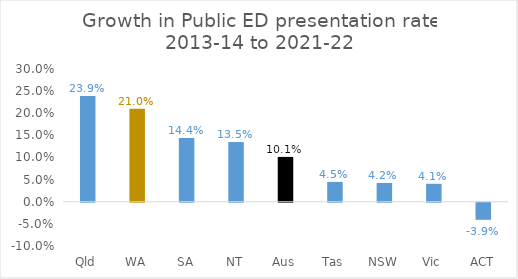
| Category | Growth in Public ED presentation rate 2013-14 to 2021-22 |
|---|---|
| Qld | 0.239 |
| WA | 0.21 |
| SA | 0.144 |
| NT | 0.135 |
| Aus | 0.101 |
| Tas | 0.045 |
| NSW | 0.042 |
| Vic | 0.041 |
| ACT | -0.039 |